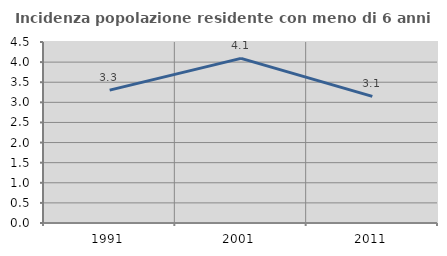
| Category | Incidenza popolazione residente con meno di 6 anni |
|---|---|
| 1991.0 | 3.304 |
| 2001.0 | 4.094 |
| 2011.0 | 3.149 |